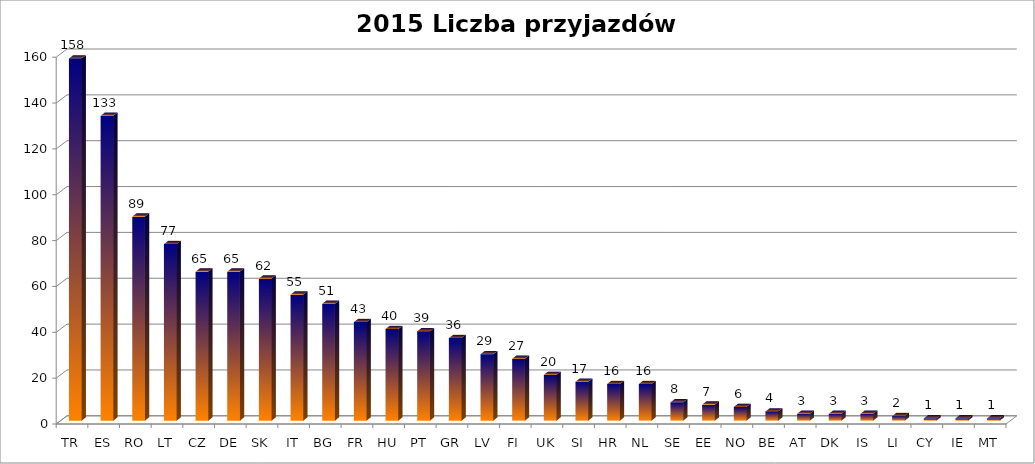
| Category | Liczba przyjazdów STT |
|---|---|
| TR | 158 |
| ES | 133 |
| RO | 89 |
| LT | 77 |
| CZ | 65 |
| DE | 65 |
| SK | 62 |
| IT | 55 |
| BG | 51 |
| FR | 43 |
| HU | 40 |
| PT | 39 |
| GR | 36 |
| LV | 29 |
| FI | 27 |
| UK | 20 |
| SI | 17 |
| HR | 16 |
| NL | 16 |
| SE | 8 |
| EE | 7 |
| NO | 6 |
| BE | 4 |
| AT | 3 |
| DK | 3 |
| IS | 3 |
| LI | 2 |
| CY | 1 |
| IE | 1 |
| MT | 1 |